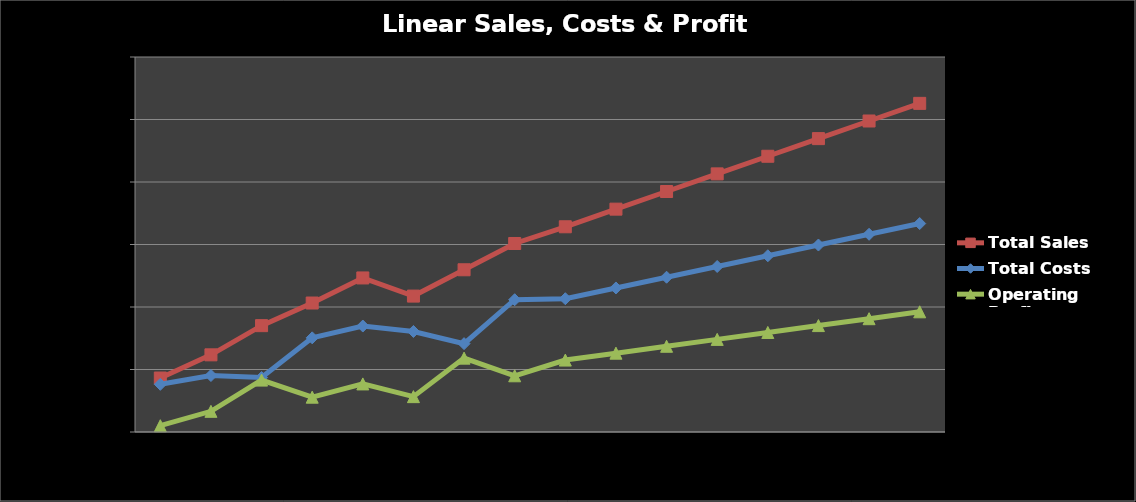
| Category | Total Sales | Total Costs | Operating Profit |
|---|---|---|---|
| 1.0 | 172658 | 152555 | 20103 |
| 2.0 | 246922 | 180722 | 66200 |
| 3.0 | 340314 | 174255 | 166059 |
| 4.0 | 412722 | 301307 | 111415 |
| 5.0 | 492957 | 339058 | 153899 |
| 6.0 | 434911 | 321715 | 113196 |
| 7.0 | 519126 | 282739 | 236387 |
| 8.0 | 603224 | 423330 | 179894 |
| 9.0 | 656729.679 | 426548.036 | 230181.643 |
| 10.0 | 713146.44 | 460900.905 | 252245.536 |
| 11.0 | 769563.202 | 495253.774 | 274309.429 |
| 12.0 | 825979.964 | 529606.643 | 296373.321 |
| 13.0 | 882396.726 | 563959.512 | 318437.214 |
| 14.0 | 938813.488 | 598312.381 | 340501.107 |
| 15.0 | 995230.25 | 632665.25 | 362565 |
| 16.0 | 1051647.012 | 667018.119 | 384628.893 |